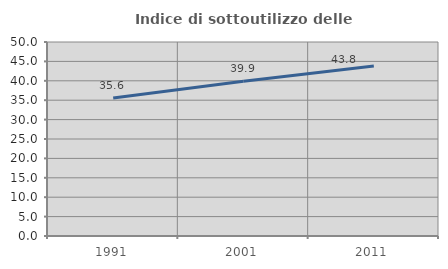
| Category | Indice di sottoutilizzo delle abitazioni  |
|---|---|
| 1991.0 | 35.564 |
| 2001.0 | 39.911 |
| 2011.0 | 43.793 |